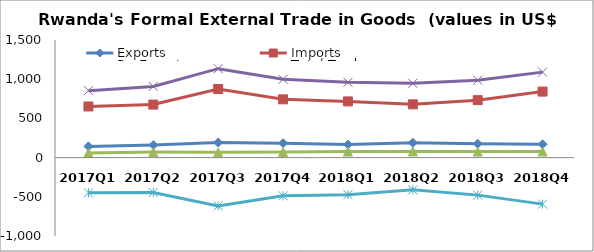
| Category | Exports | Imports | Re-Exports | Total Trade | Trade Balance |
|---|---|---|---|---|---|
| 2017Q1 | 143.077 | 651.996 | 59.162 | 854.234 | -449.757 |
| 2017Q2 | 160.66 | 676.27 | 70.307 | 907.238 | -445.303 |
| 2017Q3 | 192.175 | 875.018 | 67.195 | 1134.389 | -615.648 |
| 2017Q4 | 184.236 | 743.149 | 71.45 | 998.836 | -487.463 |
| 2018Q1 | 166.601 | 716.727 | 77.492 | 960.82 | -472.634 |
| 2018Q2 | 188.932 | 679.31 | 79.223 | 947.465 | -411.154 |
| 2018Q3 | 177.258 | 732.939 | 77.1 | 987.297 | -478.581 |
| 2018Q4 | 169.913 | 841.922 | 78.507 | 1090.342 | -593.501 |